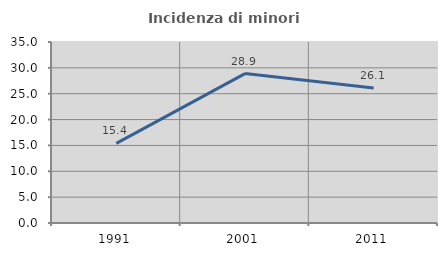
| Category | Incidenza di minori stranieri |
|---|---|
| 1991.0 | 15.385 |
| 2001.0 | 28.889 |
| 2011.0 | 26.087 |